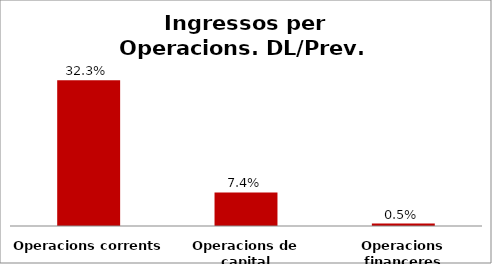
| Category | Series 0 |
|---|---|
| Operacions corrents | 0.323 |
| Operacions de capital | 0.074 |
| Operacions financeres | 0.005 |